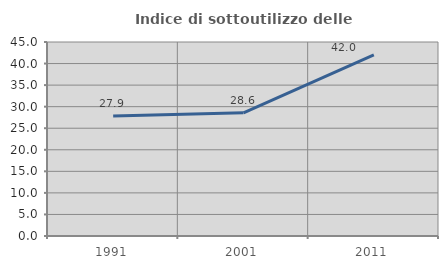
| Category | Indice di sottoutilizzo delle abitazioni  |
|---|---|
| 1991.0 | 27.863 |
| 2001.0 | 28.581 |
| 2011.0 | 42.04 |